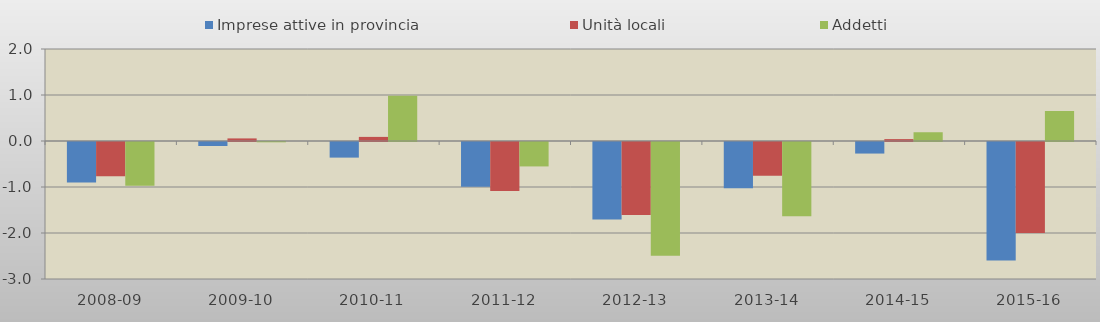
| Category | Imprese attive in provincia | Unità locali | Addetti |
|---|---|---|---|
| 2008-09 | -0.883 | -0.743 | -0.95 |
| 2009-10 | -0.087 | 0.056 | -0.007 |
| 2010-11 | -0.34 | 0.089 | 0.983 |
| 2011-12 | -0.974 | -1.064 | -0.531 |
| 2012-13 | -1.683 | -1.587 | -2.475 |
| 2013-14 | -1.006 | -0.732 | -1.617 |
| 2014-15 | -0.251 | 0.041 | 0.19 |
| 2015-16 | -2.575 | -1.976 | 0.652 |